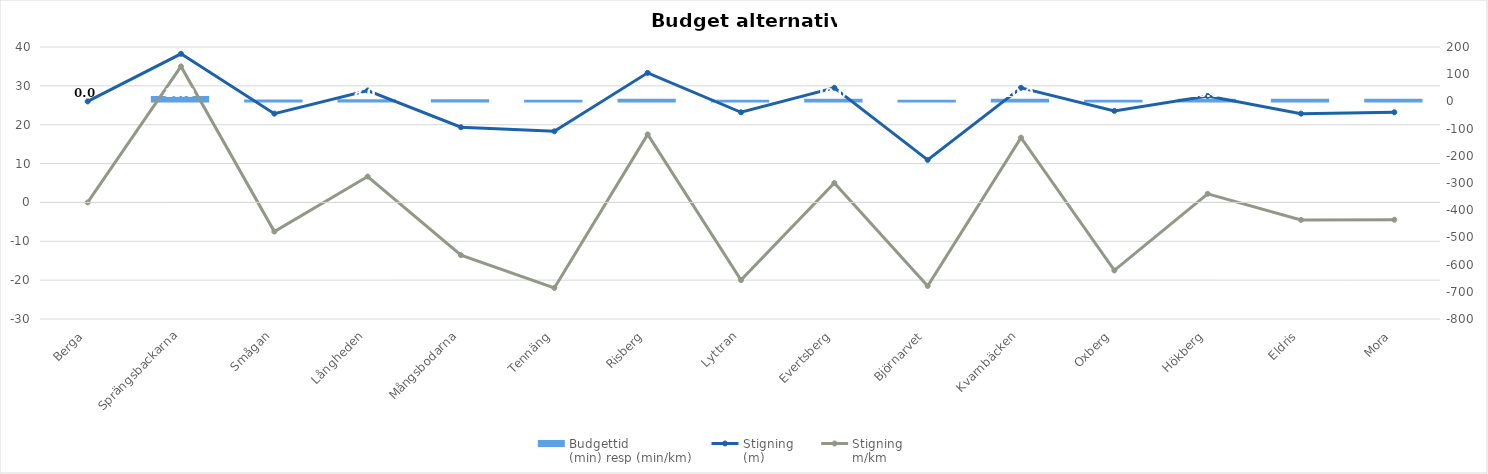
| Category | Budgettid
(min) resp (min/km) |
|---|---|
| Berga | 0 |
| Sprängsbackarna | 20 |
| Smågan | 7 |
| Långheden | 8 |
| Mångsbodarna | 7.5 |
| Tennäng | 6 |
| Risberg | 10 |
| Lyttran | 6 |
| Evertsberg | 10 |
| Björnarvet | 6 |
| Kvarnbäcken | 10 |
| Oxberg | 6 |
| Hökberg | 10 |
| Eldris | 10 |
| Mora | 10 |